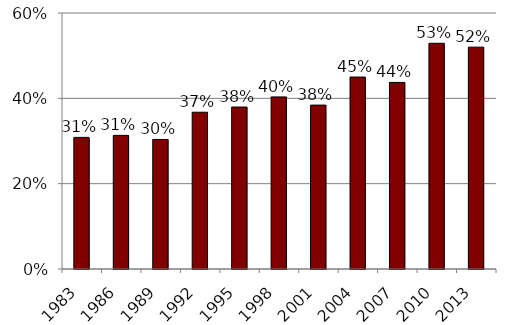
| Category | Series 0 |
|---|---|
| 1983.0 | 0.308 |
| 1986.0 | 0.313 |
| 1989.0 | 0.304 |
| 1992.0 | 0.367 |
| 1995.0 | 0.38 |
| 1998.0 | 0.403 |
| 2001.0 | 0.384 |
| 2004.0 | 0.45 |
| 2007.0 | 0.437 |
| 2010.0 | 0.529 |
| 2013.0 | 0.52 |